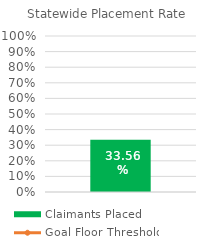
| Category | Claimants Placed |
|---|---|
| 0 | 0.336 |